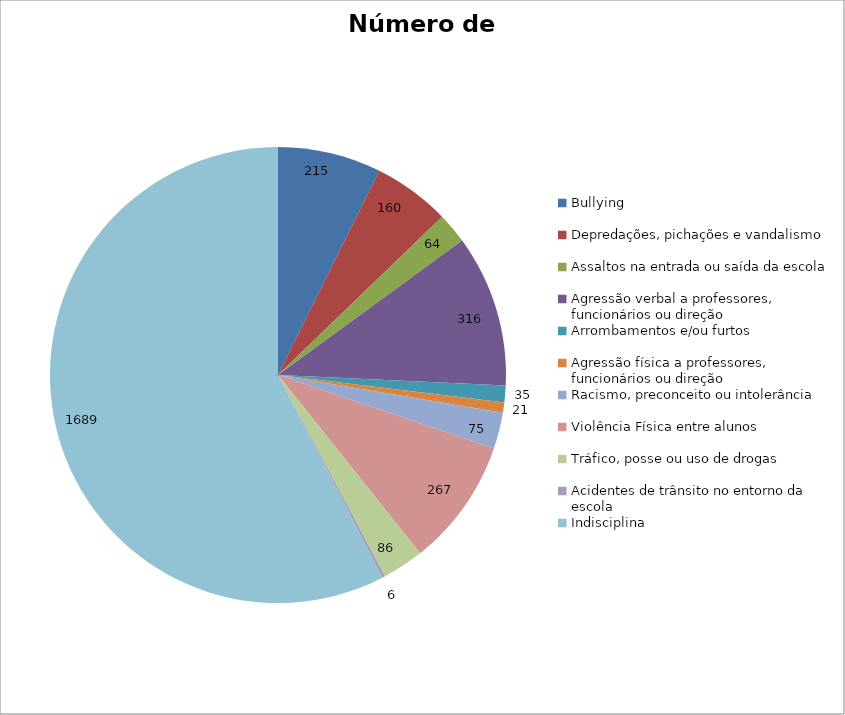
| Category | Número de Casos |
|---|---|
| Bullying | 215 |
| Depredações, pichações e vandalismo | 160 |
| Assaltos na entrada ou saída da escola | 64 |
| Agressão verbal a professores, funcionários ou direção | 316 |
| Arrombamentos e/ou furtos | 35 |
| Agressão física a professores, funcionários ou direção | 21 |
| Racismo, preconceito ou intolerância | 75 |
| Violência Física entre alunos | 267 |
| Tráfico, posse ou uso de drogas | 86 |
| Acidentes de trânsito no entorno da escola | 6 |
| Indisciplina | 1689 |